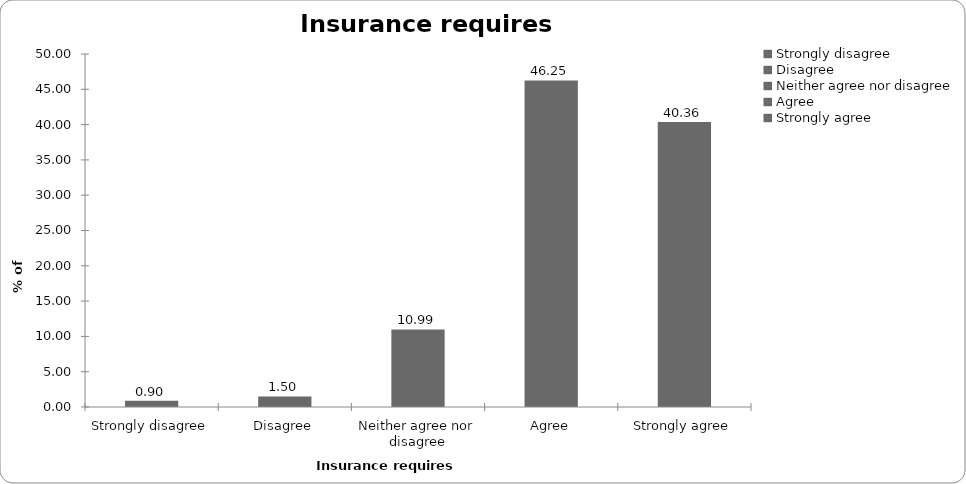
| Category | Insurance requires regulation |
|---|---|
| Strongly disagree | 0.899 |
| Disagree | 1.499 |
| Neither agree nor disagree | 10.989 |
| Agree | 46.254 |
| Strongly agree | 40.36 |